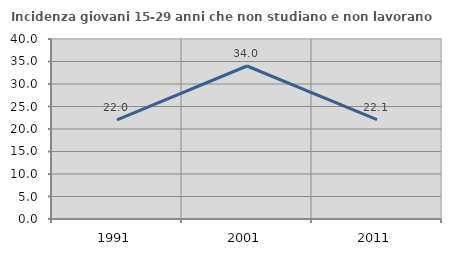
| Category | Incidenza giovani 15-29 anni che non studiano e non lavorano  |
|---|---|
| 1991.0 | 22.041 |
| 2001.0 | 34 |
| 2011.0 | 22.078 |